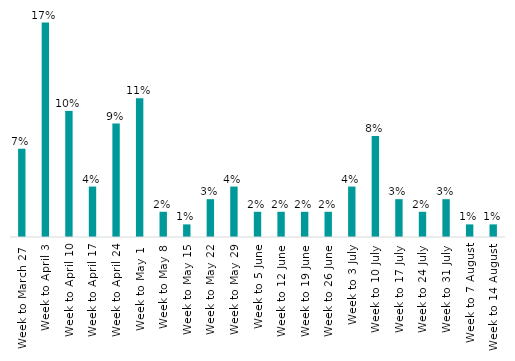
| Category | Series 0 |
|---|---|
| Week to March 27  | 0.07 |
| Week to April 3 | 0.17 |
| Week to April 10 | 0.1 |
| Week to April 17 | 0.04 |
| Week to April 24 | 0.09 |
| Week to May 1  | 0.11 |
| Week to May 8 | 0.02 |
| Week to May 15 | 0.01 |
| Week to May 22 | 0.03 |
| Week to May 29 | 0.04 |
| Week to 5 June | 0.02 |
| Week to 12 June | 0.02 |
| Week to 19 June | 0.02 |
| Week to 26 June | 0.02 |
| Week to 3 July | 0.04 |
| Week to 10 July | 0.08 |
| Week to 17 July | 0.03 |
| Week to 24 July | 0.02 |
| Week to 31 July | 0.03 |
| Week to 7 August | 0.01 |
| Week to 14 August | 0.01 |